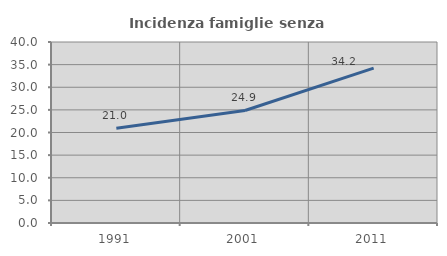
| Category | Incidenza famiglie senza nuclei |
|---|---|
| 1991.0 | 20.951 |
| 2001.0 | 24.864 |
| 2011.0 | 34.218 |